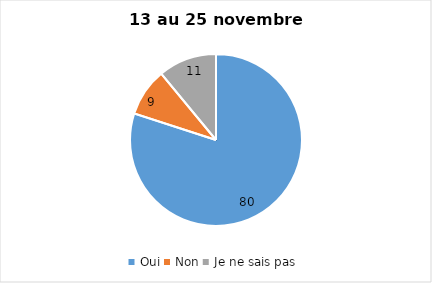
| Category | Series 0 |
|---|---|
| Oui | 80 |
| Non | 9 |
| Je ne sais pas | 11 |